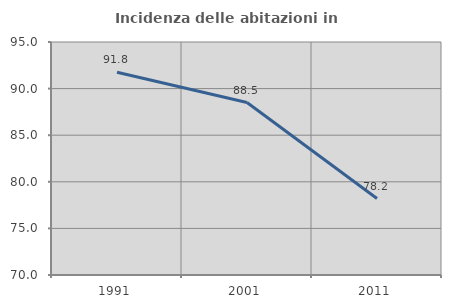
| Category | Incidenza delle abitazioni in proprietà  |
|---|---|
| 1991.0 | 91.758 |
| 2001.0 | 88.506 |
| 2011.0 | 78.205 |